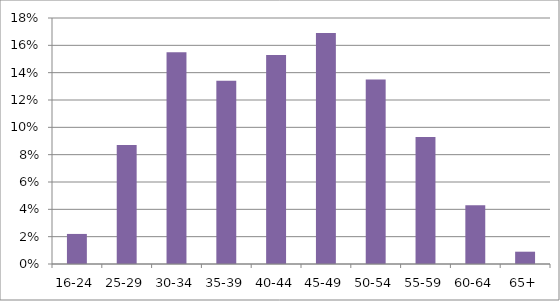
| Category | Total |
|---|---|
| 16-24 | 0.022 |
| 25-29 | 0.087 |
| 30-34 | 0.155 |
| 35-39 | 0.134 |
| 40-44 | 0.153 |
| 45-49 | 0.169 |
| 50-54 | 0.135 |
| 55-59 | 0.093 |
| 60-64 | 0.043 |
| 65+ | 0.009 |